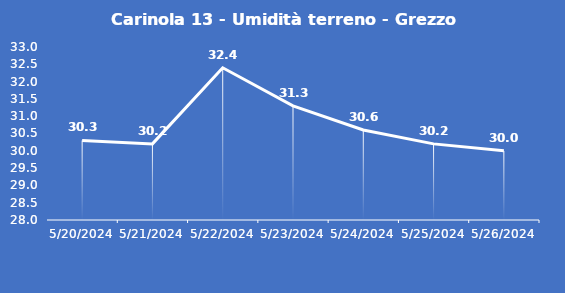
| Category | Carinola 13 - Umidità terreno - Grezzo (%VWC) |
|---|---|
| 5/20/24 | 30.3 |
| 5/21/24 | 30.2 |
| 5/22/24 | 32.4 |
| 5/23/24 | 31.3 |
| 5/24/24 | 30.6 |
| 5/25/24 | 30.2 |
| 5/26/24 | 30 |